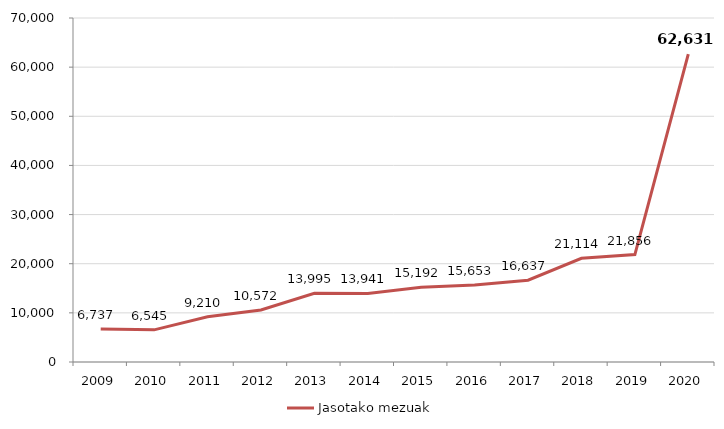
| Category | Jasotako mezuak |
|---|---|
| 2009.0 | 6737 |
| 2010.0 | 6545 |
| 2011.0 | 9210 |
| 2012.0 | 10572 |
| 2013.0 | 13995 |
| 2014.0 | 13941 |
| 2015.0 | 15192 |
| 2016.0 | 15653 |
| 2017.0 | 16637 |
| 2018.0 | 21114 |
| 2019.0 | 21856 |
| 2020.0 | 62631 |